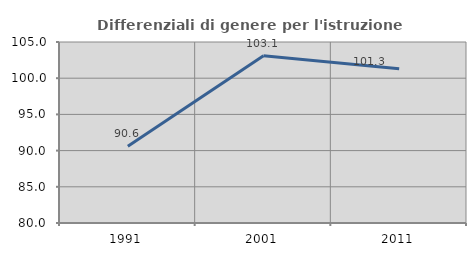
| Category | Differenziali di genere per l'istruzione superiore |
|---|---|
| 1991.0 | 90.618 |
| 2001.0 | 103.112 |
| 2011.0 | 101.29 |